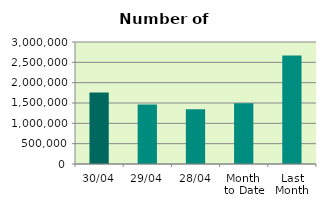
| Category | Series 0 |
|---|---|
| 30/04 | 1759718 |
| 29/04 | 1464330 |
| 28/04 | 1346876 |
| Month 
to Date | 1493476.8 |
| Last
Month | 2666736.455 |